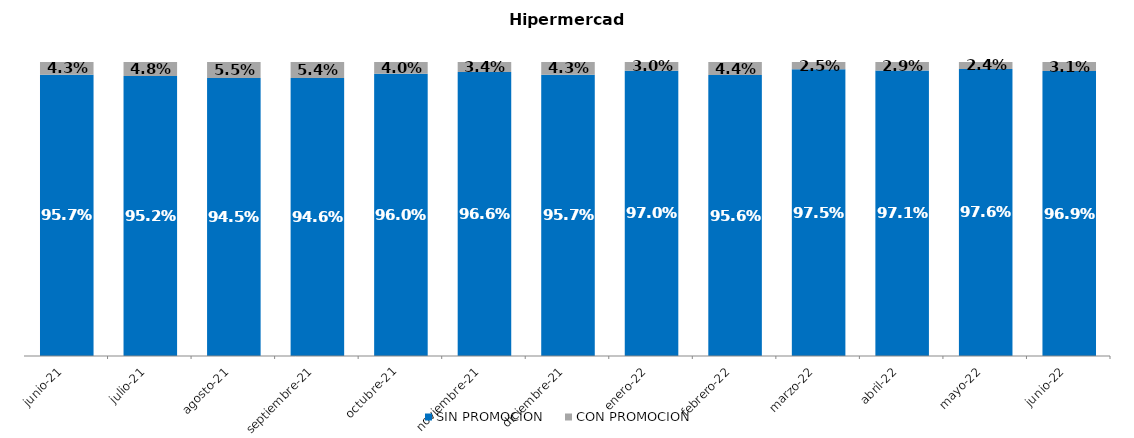
| Category | SIN PROMOCION   | CON PROMOCION   |
|---|---|---|
| 2021-06-01 | 0.957 | 0.043 |
| 2021-07-01 | 0.952 | 0.048 |
| 2021-08-01 | 0.945 | 0.055 |
| 2021-09-01 | 0.946 | 0.054 |
| 2021-10-01 | 0.96 | 0.04 |
| 2021-11-01 | 0.966 | 0.034 |
| 2021-12-01 | 0.957 | 0.043 |
| 2022-01-01 | 0.97 | 0.03 |
| 2022-02-01 | 0.956 | 0.044 |
| 2022-03-01 | 0.975 | 0.025 |
| 2022-04-01 | 0.971 | 0.029 |
| 2022-05-01 | 0.976 | 0.024 |
| 2022-06-01 | 0.969 | 0.031 |